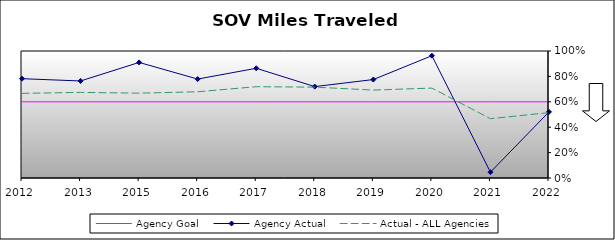
| Category | Agency Goal | Agency Actual | Actual - ALL Agencies |
|---|---|---|---|
| 2012.0 | 0.6 | 0.782 | 0.666 |
| 2013.0 | 0.6 | 0.764 | 0.674 |
| 2015.0 | 0.6 | 0.91 | 0.668 |
| 2016.0 | 0.6 | 0.779 | 0.679 |
| 2017.0 | 0.6 | 0.864 | 0.719 |
| 2018.0 | 0.6 | 0.72 | 0.715 |
| 2019.0 | 0.6 | 0.775 | 0.692 |
| 2020.0 | 0.6 | 0.963 | 0.708 |
| 2021.0 | 0.6 | 0.046 | 0.467 |
| 2022.0 | 0.6 | 0.521 | 0.515 |